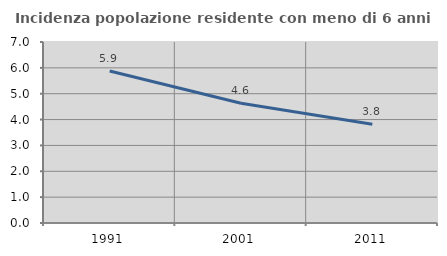
| Category | Incidenza popolazione residente con meno di 6 anni |
|---|---|
| 1991.0 | 5.88 |
| 2001.0 | 4.633 |
| 2011.0 | 3.821 |